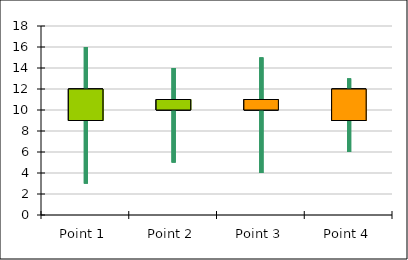
| Category | Open | High | Low | Close |
|---|---|---|---|---|
| Point 1 | 9 | 16 | 3 | 12 |
| Point 2 | 10 | 14 | 5 | 11 |
| Point 3 | 11 | 15 | 4 | 10 |
| Point 4 | 12 | 13 | 6 | 9 |